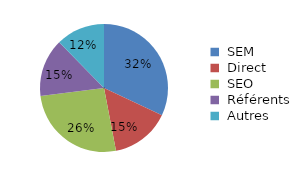
| Category | TRAFIC & COMPORTEMENT |
|---|---|
|  SEM  | 5064.64 |
|  Direct  | 2374.05 |
|  SEO  | 4115.02 |
|  Référents  | 2318.931 |
|  Autres  | 1954.359 |